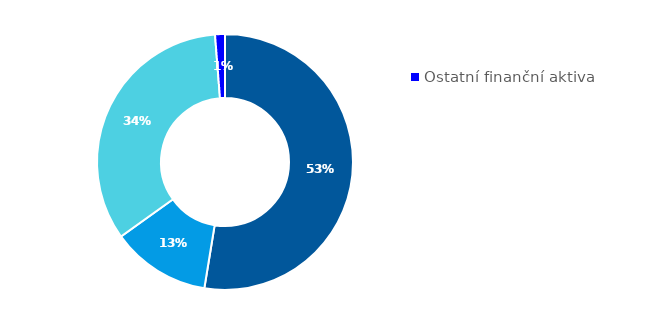
| Category | Series 0 |
|---|---|
| Hotovost | 0.526 |
| Půjčky poskytnuté nemovitostní společnosti | 0.125 |
| Majetkové účasti v nemovitostní společnosti | 0.336 |
| Ostatní finanční aktiva | 0.012 |